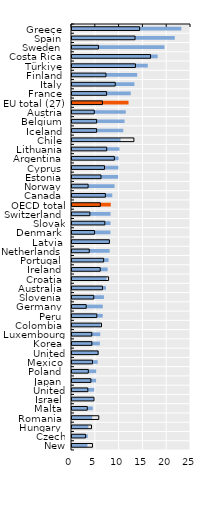
| Category | Foreign-born  | Native-born |
|---|---|---|
| Greece | 22.962 | 14.208 |
| Spain | 21.587 | 13.247 |
| Sweden | 19.416 | 5.555 |
| Costa Rica | 18 | 16.5 |
| Türkiye | 15.922 | 13.321 |
| Finland | 13.696 | 7.13 |
| Italy | 13.107 | 9.081 |
| France | 12.343 | 7.269 |
| EU total (27) | 11.877 | 6.389 |
| Austria | 11.299 | 4.675 |
| Belgium | 11.042 | 5.177 |
| Iceland | 10.767 | 5.171 |
| Chile | 10.2 | 13 |
| Lithuania | 9.969 | 7.291 |
| Argentina | 9.8 | 8.9 |
| Cyprus | 9.745 | 6.825 |
| Estonia | 9.696 | 6.094 |
| Norway | 8.938 | 3.382 |
| Canada | 8.461 | 7.016 |
| OECD total (37) | 8.151 | 5.942 |
| Switzerland | 8.105 | 3.76 |
| Slovak Republic | 8.086 | 6.896 |
| Denmark | 8.073 | 4.742 |
| Latvia | 7.998 | 7.851 |
| Netherlands | 7.915 | 3.625 |
| Portugal | 7.69 | 6.647 |
| Ireland | 7.479 | 5.923 |
| Croatia | 7.25 | 7.682 |
| Australia | 7.13 | 6.406 |
| Slovenia | 6.708 | 4.572 |
| Germany | 6.467 | 2.984 |
| Peru | 6.464 | 5.211 |
| Colombia | 6 | 6.2 |
| Luxembourg | 5.934 | 4.158 |
| Korea | 5.85 | 4.181 |
| United States | 5.6 | 5.49 |
| Mexico | 5.4 | 4.3 |
| Poland | 5.075 | 3.424 |
| Japan | 5.056 | 3.968 |
| United Kingdom | 4.661 | 3.325 |
| Israel | 4.57 | 4.62 |
| Malta | 4.369 | 3.212 |
| Romania | 4.244 | 5.626 |
| Hungary | 3.442 | 4.094 |
| Czech Republic | 3.322 | 2.854 |
| New Zealand | 3.241 | 4.301 |